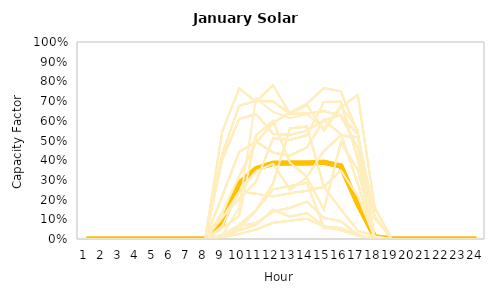
| Category | Series 0 | Series 52 | Series 53 | Series 54 | Series 55 | Series 56 | Series 57 | Series 58 | Series 59 | Series 60 | Series 61 | Series 62 | Series 63 | Series 64 | Series 65 | Series 66 | Series 67 | Series 68 | Series 69 | Series 70 | Series 71 | Series 72 | Series 73 | Series 74 | Series 75 | Series 76 | Series 77 | Series 78 | Series 79 | Series 80 | Series 81 | Series 82 | Series 83 | Series 84 | Series 85 | Series 86 | Series 87 | Series 88 | Series 89 | Series 90 | Series 91 | Series 92 | Series 93 | Series 94 | Series 95 | Series 96 | Series 97 | Series 98 | Series 99 | Series 100 | Series 101 | Series 1 | Series 2 | Series 3 | Series 4 | Series 5 | Series 6 | Series 7 | Series 8 | Series 9 | Series 10 | Series 11 | Series 12 | Series 13 | Series 14 | Series 15 | Series 16 | Series 17 | Series 18 | Series 19 | Series 20 | Series 21 | Series 22 | Series 23 | Series 24 | Series 25 | Series 26 | Series 27 | Series 28 | Series 29 | Series 30 | Series 31 | Series 32 | Series 33 | Series 34 | Series 35 | Series 36 | Series 37 | Series 38 | Series 39 | Series 40 | Series 41 | Series 42 | Series 43 | Series 44 | Series 45 | Series 46 | Series 47 | Series 48 | Series 49 | Series 50 | Series 51 |
|---|---|---|---|---|---|---|---|---|---|---|---|---|---|---|---|---|---|---|---|---|---|---|---|---|---|---|---|---|---|---|---|---|---|---|---|---|---|---|---|---|---|---|---|---|---|---|---|---|---|---|---|---|---|---|---|---|---|---|---|---|---|---|---|---|---|---|---|---|---|---|---|---|---|---|---|---|---|---|---|---|---|---|---|---|---|---|---|---|---|---|---|---|---|---|---|---|---|---|---|---|---|---|
| 0 | 0 | 0 |  |  |  | 0 |  |  |  | 0 |  |  |  | 0 |  |  |  | 0 |  | 0 |  | 0 |  | 0 |  | 0 |  |  |  | 0 |  |  |  | 0 |  |  |  | 0 |  |  |  | 0 |  |  |  | 0 |  |  |  |  | 0 | 0 | 0 |  |  |  | 0 |  |  |  | 0 |  |  |  | 0 |  |  |  | 0 |  | 0 |  | 0 |  | 0 |  | 0 |  |  |  | 0 |  |  |  | 0 |  |  |  | 0 |  |  |  | 0 |  |  |  | 0 |  |  |  |  | 0 |
| 1 | 0 | 0 |  |  |  | 0 |  |  |  | 0 |  |  |  | 0 |  |  |  | 0 |  | 0 |  | 0 |  | 0 |  | 0 |  |  |  | 0 |  |  |  | 0 |  |  |  | 0 |  |  |  | 0 |  |  |  | 0 |  |  |  |  | 0 | 0 | 0 |  |  |  | 0 |  |  |  | 0 |  |  |  | 0 |  |  |  | 0 |  | 0 |  | 0 |  | 0 |  | 0 |  |  |  | 0 |  |  |  | 0 |  |  |  | 0 |  |  |  | 0 |  |  |  | 0 |  |  |  |  | 0 |
| 2 | 0 | 0 |  |  |  | 0 |  |  |  | 0 |  |  |  | 0 |  |  |  | 0 |  | 0 |  | 0 |  | 0 |  | 0 |  |  |  | 0 |  |  |  | 0 |  |  |  | 0 |  |  |  | 0 |  |  |  | 0 |  |  |  |  | 0 | 0 | 0 |  |  |  | 0 |  |  |  | 0 |  |  |  | 0 |  |  |  | 0 |  | 0 |  | 0 |  | 0 |  | 0 |  |  |  | 0 |  |  |  | 0 |  |  |  | 0 |  |  |  | 0 |  |  |  | 0 |  |  |  |  | 0 |
| 3 | 0 | 0 |  |  |  | 0 |  |  |  | 0 |  |  |  | 0 |  |  |  | 0 |  | 0 |  | 0 |  | 0 |  | 0 |  |  |  | 0 |  |  |  | 0 |  |  |  | 0 |  |  |  | 0 |  |  |  | 0 |  |  |  |  | 0 | 0 | 0 |  |  |  | 0 |  |  |  | 0 |  |  |  | 0 |  |  |  | 0 |  | 0 |  | 0 |  | 0 |  | 0 |  |  |  | 0 |  |  |  | 0 |  |  |  | 0 |  |  |  | 0 |  |  |  | 0 |  |  |  |  | 0 |
| 4 | 0 | 0 |  |  |  | 0 |  |  |  | 0 |  |  |  | 0 |  |  |  | 0 |  | 0 |  | 0 |  | 0 |  | 0 |  |  |  | 0 |  |  |  | 0 |  |  |  | 0 |  |  |  | 0 |  |  |  | 0 |  |  |  |  | 0 | 0 | 0 |  |  |  | 0 |  |  |  | 0 |  |  |  | 0 |  |  |  | 0 |  | 0 |  | 0 |  | 0 |  | 0 |  |  |  | 0 |  |  |  | 0 |  |  |  | 0 |  |  |  | 0 |  |  |  | 0 |  |  |  |  | 0 |
| 5 | 0 | 0 |  |  |  | 0 |  |  |  | 0 |  |  |  | 0 |  |  |  | 0 |  | 0 |  | 0 |  | 0 |  | 0 |  |  |  | 0 |  |  |  | 0 |  |  |  | 0 |  |  |  | 0 |  |  |  | 0 |  |  |  |  | 0 | 0 | 0 |  |  |  | 0 |  |  |  | 0 |  |  |  | 0 |  |  |  | 0 |  | 0 |  | 0 |  | 0 |  | 0 |  |  |  | 0 |  |  |  | 0 |  |  |  | 0 |  |  |  | 0 |  |  |  | 0 |  |  |  |  | 0 |
| 6 | 0 | 0 |  |  |  | 0 |  |  |  | 0 |  |  |  | 0 |  |  |  | 0 |  | 0 |  | 0 |  | 0 |  | 0 |  |  |  | 0 |  |  |  | 0 |  |  |  | 0 |  |  |  | 0 |  |  |  | 0 |  |  |  |  | 0 | 0 | 0 |  |  |  | 0 |  |  |  | 0 |  |  |  | 0 |  |  |  | 0 |  | 0 |  | 0 |  | 0 |  | 0 |  |  |  | 0 |  |  |  | 0 |  |  |  | 0 |  |  |  | 0 |  |  |  | 0 |  |  |  |  | 0 |
| 7 | 0 | 0 |  |  |  | 0 |  |  |  | 0 |  |  |  | 0 |  |  |  | 0 |  | 0 |  | 0 |  | 0 |  | 0 |  |  |  | 0 |  |  |  | 0 |  |  |  | 0 |  |  |  | 0 |  |  |  | 0 |  |  |  |  | 0 | 0 | 0 |  |  |  | 0 |  |  |  | 0 |  |  |  | 0 |  |  |  | 0 |  | 0 |  | 0 |  | 0 |  | 0 |  |  |  | 0 |  |  |  | 0 |  |  |  | 0 |  |  |  | 0 |  |  |  | 0 |  |  |  |  | 0 |
| 8 | 0.079 | 0.134 |  |  |  | 0.216 |  |  |  | 0.019 |  |  |  | 0.02 |  |  |  | 0.012 |  | 0.022 |  | 0.544 |  | 0.11 |  | 0.065 |  |  |  | 0.008 |  |  |  | 0.019 |  |  |  | 0.105 |  |  |  | 0.428 |  |  |  | 0.402 |  |  |  |  | 0.056 | 0.079 | 0.134 |  |  |  | 0.216 |  |  |  | 0.019 |  |  |  | 0.02 |  |  |  | 0.012 |  | 0.022 |  | 0.544 |  | 0.11 |  | 0.065 |  |  |  | 0.008 |  |  |  | 0.019 |  |  |  | 0.105 |  |  |  | 0.428 |  |  |  | 0.402 |  |  |  |  | 0.056 |
| 9 | 0.283 | 0.316 |  |  |  | 0.442 |  |  |  | 0.071 |  |  |  | 0.157 |  |  |  | 0.044 |  | 0.068 |  | 0.765 |  | 0.203 |  | 0.239 |  |  |  | 0.025 |  |  |  | 0.052 |  |  |  | 0.241 |  |  |  | 0.676 |  |  |  | 0.609 |  |  |  |  | 0.117 | 0.283 | 0.316 |  |  |  | 0.442 |  |  |  | 0.071 |  |  |  | 0.157 |  |  |  | 0.044 |  | 0.068 |  | 0.765 |  | 0.203 |  | 0.239 |  |  |  | 0.025 |  |  |  | 0.052 |  |  |  | 0.241 |  |  |  | 0.676 |  |  |  | 0.609 |  |  |  |  | 0.117 |
| 10 | 0.357 | 0.489 |  |  |  | 0.494 |  |  |  | 0.146 |  |  |  | 0.714 |  |  |  | 0.072 |  | 0.08 |  | 0.697 |  | 0.291 |  | 0.23 |  |  |  | 0.048 |  |  |  | 0.145 |  |  |  | 0.345 |  |  |  | 0.702 |  |  |  | 0.635 |  |  |  |  | 0.526 | 0.357 | 0.489 |  |  |  | 0.494 |  |  |  | 0.146 |  |  |  | 0.714 |  |  |  | 0.072 |  | 0.08 |  | 0.697 |  | 0.291 |  | 0.23 |  |  |  | 0.048 |  |  |  | 0.145 |  |  |  | 0.345 |  |  |  | 0.702 |  |  |  | 0.635 |  |  |  |  | 0.526 |
| 11 | 0.384 | 0.59 |  |  |  | 0.439 |  |  |  | 0.252 |  |  |  | 0.646 |  |  |  | 0.149 |  | 0.139 |  | 0.78 |  | 0.511 |  | 0.216 |  |  |  | 0.082 |  |  |  | 0.282 |  |  |  | 0.382 |  |  |  | 0.698 |  |  |  | 0.533 |  |  |  |  | 0.599 | 0.384 | 0.59 |  |  |  | 0.439 |  |  |  | 0.252 |  |  |  | 0.646 |  |  |  | 0.149 |  | 0.139 |  | 0.78 |  | 0.511 |  | 0.216 |  |  |  | 0.082 |  |  |  | 0.282 |  |  |  | 0.382 |  |  |  | 0.698 |  |  |  | 0.533 |  |  |  |  | 0.599 |
| 12 | 0.385 | 0.641 |  |  |  | 0.423 |  |  |  | 0.269 |  |  |  | 0.614 |  |  |  | 0.113 |  | 0.158 |  | 0.636 |  | 0.503 |  | 0.232 |  |  |  | 0.093 |  |  |  | 0.562 |  |  |  | 0.251 |  |  |  | 0.637 |  |  |  | 0.529 |  |  |  |  | 0.388 | 0.385 | 0.641 |  |  |  | 0.423 |  |  |  | 0.269 |  |  |  | 0.614 |  |  |  | 0.113 |  | 0.158 |  | 0.636 |  | 0.503 |  | 0.232 |  |  |  | 0.093 |  |  |  | 0.562 |  |  |  | 0.251 |  |  |  | 0.637 |  |  |  | 0.529 |  |  |  |  | 0.388 |
| 13 | 0.386 | 0.686 |  |  |  | 0.465 |  |  |  | 0.285 |  |  |  | 0.633 |  |  |  | 0.132 |  | 0.19 |  | 0.636 |  | 0.527 |  | 0.245 |  |  |  | 0.103 |  |  |  | 0.571 |  |  |  | 0.311 |  |  |  | 0.68 |  |  |  | 0.549 |  |  |  |  | 0.316 | 0.386 | 0.686 |  |  |  | 0.465 |  |  |  | 0.285 |  |  |  | 0.633 |  |  |  | 0.132 |  | 0.19 |  | 0.636 |  | 0.527 |  | 0.245 |  |  |  | 0.103 |  |  |  | 0.571 |  |  |  | 0.311 |  |  |  | 0.68 |  |  |  | 0.549 |  |  |  |  | 0.316 |
| 14 | 0.389 | 0.766 |  |  |  | 0.606 |  |  |  | 0.057 |  |  |  | 0.564 |  |  |  | 0.065 |  | 0.107 |  | 0.65 |  | 0.696 |  | 0.265 |  |  |  | 0.064 |  |  |  | 0.264 |  |  |  | 0.15 |  |  |  | 0.551 |  |  |  | 0.604 |  |  |  |  | 0.447 | 0.389 | 0.766 |  |  |  | 0.606 |  |  |  | 0.057 |  |  |  | 0.564 |  |  |  | 0.065 |  | 0.107 |  | 0.65 |  | 0.696 |  | 0.265 |  |  |  | 0.064 |  |  |  | 0.264 |  |  |  | 0.15 |  |  |  | 0.551 |  |  |  | 0.604 |  |  |  |  | 0.447 |
| 15 | 0.371 | 0.749 |  |  |  | 0.532 |  |  |  | 0.051 |  |  |  | 0.677 |  |  |  | 0.045 |  | 0.091 |  | 0.625 |  | 0.696 |  | 0.151 |  |  |  | 0.056 |  |  |  | 0.349 |  |  |  | 0.49 |  |  |  | 0.668 |  |  |  | 0.627 |  |  |  |  | 0.526 | 0.371 | 0.749 |  |  |  | 0.532 |  |  |  | 0.051 |  |  |  | 0.677 |  |  |  | 0.045 |  | 0.091 |  | 0.625 |  | 0.696 |  | 0.151 |  |  |  | 0.056 |  |  |  | 0.349 |  |  |  | 0.49 |  |  |  | 0.668 |  |  |  | 0.627 |  |  |  |  | 0.526 |
| 16 | 0.176 | 0.538 |  |  |  | 0.28 |  |  |  | 0.018 |  |  |  | 0.552 |  |  |  | 0.017 |  | 0.021 |  | 0.463 |  | 0.404 |  | 0.043 |  |  |  | 0.018 |  |  |  | 0.218 |  |  |  | 0.351 |  |  |  | 0.732 |  |  |  | 0.531 |  |  |  |  | 0.517 | 0.176 | 0.538 |  |  |  | 0.28 |  |  |  | 0.018 |  |  |  | 0.552 |  |  |  | 0.017 |  | 0.021 |  | 0.463 |  | 0.404 |  | 0.043 |  |  |  | 0.018 |  |  |  | 0.218 |  |  |  | 0.351 |  |  |  | 0.732 |  |  |  | 0.531 |  |  |  |  | 0.517 |
| 17 | 0.012 | 0 |  |  |  | 0 |  |  |  | 0 |  |  |  | 0 |  |  |  | 0 |  | 0 |  | 0 |  | 0.002 |  | 0.014 |  |  |  | 0.001 |  |  |  | 0.004 |  |  |  | 0.008 |  |  |  | 0.158 |  |  |  | 0.105 |  |  |  |  | 0.115 | 0.012 | 0 |  |  |  | 0 |  |  |  | 0 |  |  |  | 0 |  |  |  | 0 |  | 0 |  | 0 |  | 0.002 |  | 0.014 |  |  |  | 0.001 |  |  |  | 0.004 |  |  |  | 0.008 |  |  |  | 0.158 |  |  |  | 0.105 |  |  |  |  | 0.115 |
| 18 | 0 | 0 |  |  |  | 0 |  |  |  | 0 |  |  |  | 0 |  |  |  | 0 |  | 0 |  | 0 |  | 0 |  | 0 |  |  |  | 0 |  |  |  | 0 |  |  |  | 0 |  |  |  | 0 |  |  |  | 0 |  |  |  |  | 0 | 0 | 0 |  |  |  | 0 |  |  |  | 0 |  |  |  | 0 |  |  |  | 0 |  | 0 |  | 0 |  | 0 |  | 0 |  |  |  | 0 |  |  |  | 0 |  |  |  | 0 |  |  |  | 0 |  |  |  | 0 |  |  |  |  | 0 |
| 19 | 0 | 0 |  |  |  | 0 |  |  |  | 0 |  |  |  | 0 |  |  |  | 0 |  | 0 |  | 0 |  | 0 |  | 0 |  |  |  | 0 |  |  |  | 0 |  |  |  | 0 |  |  |  | 0 |  |  |  | 0 |  |  |  |  | 0 | 0 | 0 |  |  |  | 0 |  |  |  | 0 |  |  |  | 0 |  |  |  | 0 |  | 0 |  | 0 |  | 0 |  | 0 |  |  |  | 0 |  |  |  | 0 |  |  |  | 0 |  |  |  | 0 |  |  |  | 0 |  |  |  |  | 0 |
| 20 | 0 | 0 |  |  |  | 0 |  |  |  | 0 |  |  |  | 0 |  |  |  | 0 |  | 0 |  | 0 |  | 0 |  | 0 |  |  |  | 0 |  |  |  | 0 |  |  |  | 0 |  |  |  | 0 |  |  |  | 0 |  |  |  |  | 0 | 0 | 0 |  |  |  | 0 |  |  |  | 0 |  |  |  | 0 |  |  |  | 0 |  | 0 |  | 0 |  | 0 |  | 0 |  |  |  | 0 |  |  |  | 0 |  |  |  | 0 |  |  |  | 0 |  |  |  | 0 |  |  |  |  | 0 |
| 21 | 0 | 0 |  |  |  | 0 |  |  |  | 0 |  |  |  | 0 |  |  |  | 0 |  | 0 |  | 0 |  | 0 |  | 0 |  |  |  | 0 |  |  |  | 0 |  |  |  | 0 |  |  |  | 0 |  |  |  | 0 |  |  |  |  | 0 | 0 | 0 |  |  |  | 0 |  |  |  | 0 |  |  |  | 0 |  |  |  | 0 |  | 0 |  | 0 |  | 0 |  | 0 |  |  |  | 0 |  |  |  | 0 |  |  |  | 0 |  |  |  | 0 |  |  |  | 0 |  |  |  |  | 0 |
| 22 | 0 | 0 |  |  |  | 0 |  |  |  | 0 |  |  |  | 0 |  |  |  | 0 |  | 0 |  | 0 |  | 0 |  | 0 |  |  |  | 0 |  |  |  | 0 |  |  |  | 0 |  |  |  | 0 |  |  |  | 0 |  |  |  |  | 0 | 0 | 0 |  |  |  | 0 |  |  |  | 0 |  |  |  | 0 |  |  |  | 0 |  | 0 |  | 0 |  | 0 |  | 0 |  |  |  | 0 |  |  |  | 0 |  |  |  | 0 |  |  |  | 0 |  |  |  | 0 |  |  |  |  | 0 |
| 23 | 0 | 0 |  |  |  | 0 |  |  |  | 0 |  |  |  | 0 |  |  |  | 0 |  | 0 |  | 0 |  | 0 |  | 0 |  |  |  | 0 |  |  |  | 0 |  |  |  | 0 |  |  |  | 0 |  |  |  | 0 |  |  |  |  | 0 | 0 | 0 |  |  |  | 0 |  |  |  | 0 |  |  |  | 0 |  |  |  | 0 |  | 0 |  | 0 |  | 0 |  | 0 |  |  |  | 0 |  |  |  | 0 |  |  |  | 0 |  |  |  | 0 |  |  |  | 0 |  |  |  |  | 0 |